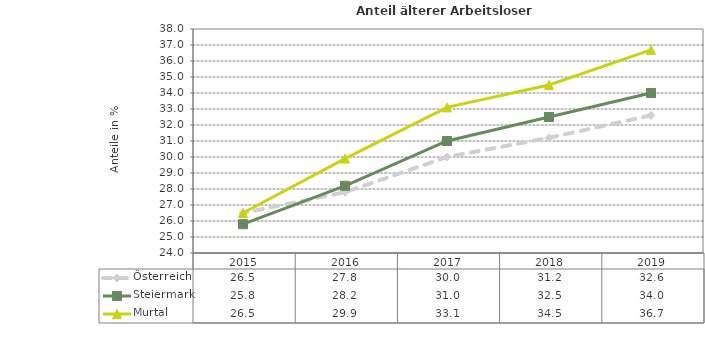
| Category | Österreich | Steiermark | Murtal |
|---|---|---|---|
| 2019.0 | 32.6 | 34 | 36.7 |
| 2018.0 | 31.2 | 32.5 | 34.5 |
| 2017.0 | 30 | 31 | 33.1 |
| 2016.0 | 27.8 | 28.2 | 29.9 |
| 2015.0 | 26.5 | 25.8 | 26.5 |